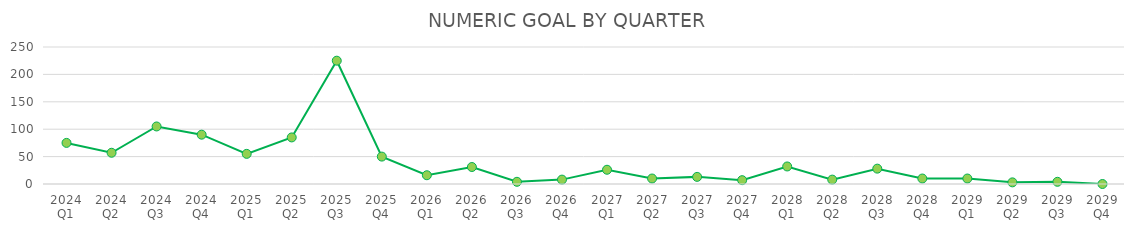
| Category | NUMERIC GOAL |
|---|---|
| 2024 Q1 | 75 |
| 2024 Q2 | 57 |
| 2024 Q3 | 105 |
| 2024 Q4 | 90 |
| 2025 Q1 | 55 |
| 2025 Q2 | 85 |
| 2025 Q3 | 225 |
| 2025 Q4 | 50 |
| 2026 Q1 | 16 |
| 2026 Q2 | 31 |
| 2026 Q3 | 4 |
| 2026 Q4 | 8 |
| 2027 Q1 | 26 |
| 2027 Q2 | 10 |
| 2027 Q3 | 13 |
| 2027 Q4 | 7 |
| 2028 Q1 | 32 |
| 2028 Q2 | 8 |
| 2028 Q3 | 28 |
| 2028 Q4 | 10 |
| 2029 Q1 | 10 |
| 2029 Q2 | 3 |
| 2029 Q3 | 4 |
| 2029 Q4 | 0 |